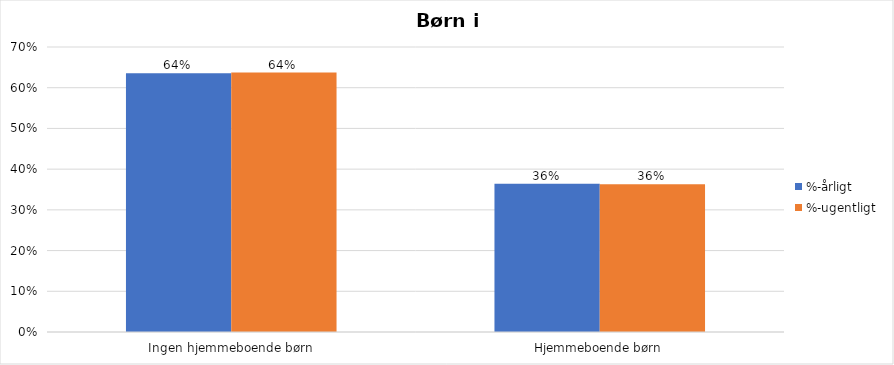
| Category | %-årligt | %-ugentligt |
|---|---|---|
| Ingen hjemmeboende børn | 0.636 | 0.637 |
| Hjemmeboende børn | 0.364 | 0.363 |